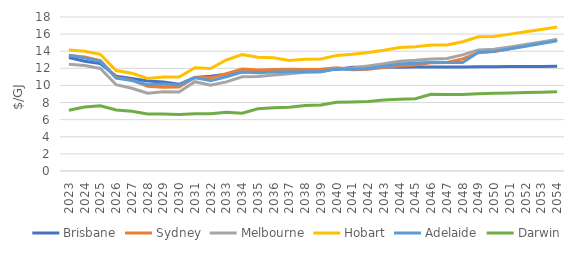
| Category | Brisbane | Sydney | Melbourne | Hobart | Adelaide | Darwin |
|---|---|---|---|---|---|---|
| 2023.0 | 13.269 | 13.503 | 12.478 | 14.135 | 13.546 | 7.102 |
| 2024.0 | 12.832 | 13.32 | 12.335 | 13.993 | 13.212 | 7.475 |
| 2025.0 | 12.548 | 12.892 | 11.984 | 13.642 | 12.811 | 7.626 |
| 2026.0 | 11.077 | 10.925 | 10.086 | 11.744 | 10.852 | 7.134 |
| 2027.0 | 10.806 | 10.626 | 9.678 | 11.418 | 10.579 | 6.978 |
| 2028.0 | 10.53 | 9.91 | 9.083 | 10.824 | 10.082 | 6.676 |
| 2029.0 | 10.41 | 9.782 | 9.256 | 10.997 | 10.163 | 6.674 |
| 2030.0 | 10.139 | 9.829 | 9.236 | 10.977 | 10.056 | 6.599 |
| 2031.0 | 10.941 | 10.941 | 10.437 | 12.079 | 10.916 | 6.692 |
| 2032.0 | 11.085 | 10.888 | 10.036 | 11.969 | 10.539 | 6.68 |
| 2033.0 | 11.305 | 11.372 | 10.417 | 12.979 | 11.023 | 6.863 |
| 2034.0 | 11.566 | 11.923 | 11.022 | 13.62 | 11.558 | 6.756 |
| 2035.0 | 11.617 | 11.799 | 11.044 | 13.287 | 11.484 | 7.267 |
| 2036.0 | 11.617 | 11.868 | 11.233 | 13.226 | 11.572 | 7.386 |
| 2037.0 | 11.617 | 11.888 | 11.362 | 12.929 | 11.608 | 7.443 |
| 2038.0 | 11.867 | 11.851 | 11.534 | 13.064 | 11.609 | 7.653 |
| 2039.0 | 11.867 | 11.884 | 11.575 | 13.105 | 11.63 | 7.727 |
| 2040.0 | 11.867 | 12.055 | 11.982 | 13.512 | 11.91 | 8.025 |
| 2041.0 | 12.121 | 11.827 | 12.052 | 13.643 | 11.879 | 8.079 |
| 2042.0 | 12.121 | 11.904 | 12.271 | 13.861 | 11.957 | 8.132 |
| 2043.0 | 12.121 | 12.09 | 12.529 | 14.12 | 12.244 | 8.311 |
| 2044.0 | 12.13 | 12.263 | 12.833 | 14.424 | 12.493 | 8.395 |
| 2045.0 | 12.152 | 12.395 | 12.945 | 14.536 | 12.601 | 8.449 |
| 2046.0 | 12.167 | 12.644 | 13.099 | 14.715 | 12.706 | 8.968 |
| 2047.0 | 12.167 | 12.687 | 13.144 | 14.72 | 12.686 | 8.943 |
| 2048.0 | 12.167 | 13.102 | 13.574 | 15.113 | 12.69 | 8.934 |
| 2049.0 | 12.182 | 13.829 | 14.154 | 15.697 | 13.891 | 9.034 |
| 2050.0 | 12.193 | 13.958 | 14.222 | 15.731 | 13.982 | 9.079 |
| 2051.0 | 12.203 | 14.298 | 14.504 | 15.999 | 14.282 | 9.124 |
| 2052.0 | 12.214 | 14.646 | 14.79 | 16.272 | 14.588 | 9.17 |
| 2053.0 | 12.225 | 15.002 | 15.083 | 16.549 | 14.901 | 9.216 |
| 2054.0 | 12.235 | 15.367 | 15.381 | 16.832 | 15.221 | 9.262 |